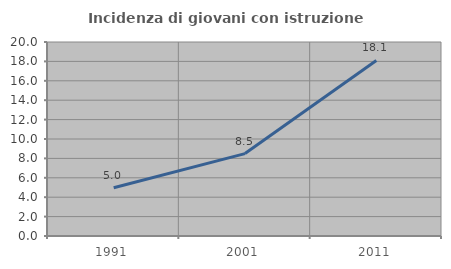
| Category | Incidenza di giovani con istruzione universitaria |
|---|---|
| 1991.0 | 4.969 |
| 2001.0 | 8.497 |
| 2011.0 | 18.095 |